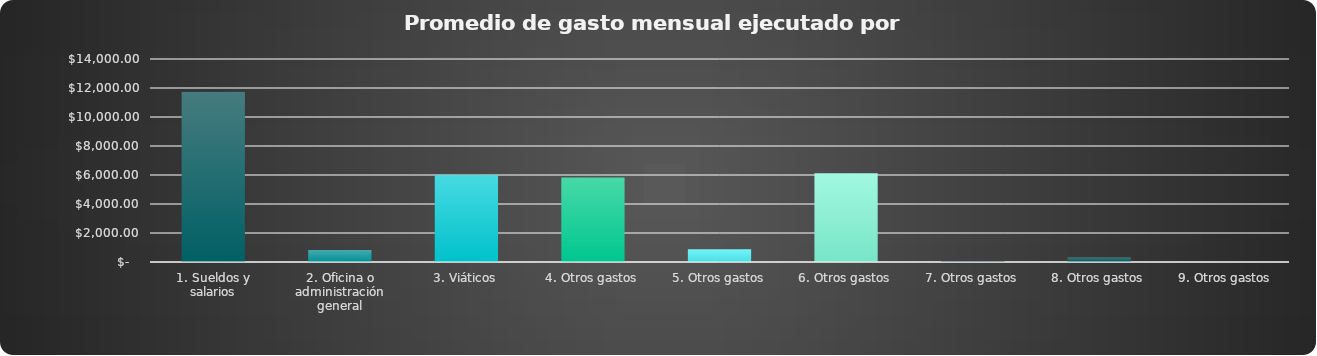
| Category | Promedio |
|---|---|
| 1. Sueldos y salarios | 11750 |
| 2. Oficina o administración general | 833.333 |
| 3. Viáticos | 6000 |
| 4. Otros gastos | 5833.333 |
| 5. Otros gastos | 875 |
| 6. Otros gastos | 6125 |
| 7. Otros gastos | 66.667 |
| 8. Otros gastos | 333.333 |
| 9. Otros gastos | 8.333 |